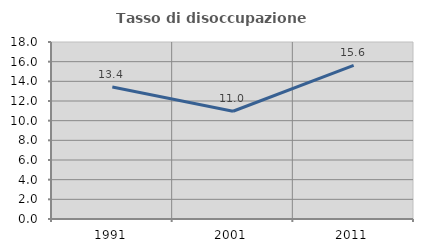
| Category | Tasso di disoccupazione giovanile  |
|---|---|
| 1991.0 | 13.433 |
| 2001.0 | 10.959 |
| 2011.0 | 15.625 |